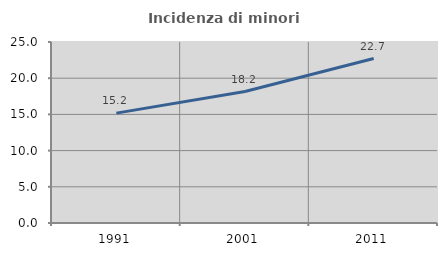
| Category | Incidenza di minori stranieri |
|---|---|
| 1991.0 | 15.179 |
| 2001.0 | 18.153 |
| 2011.0 | 22.717 |